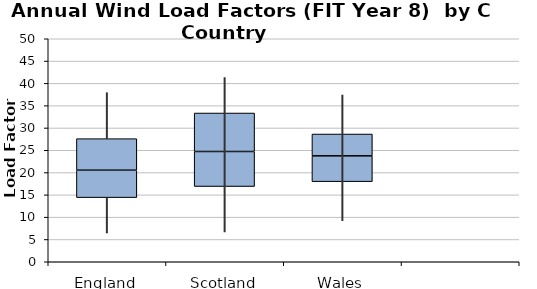
| Category | Series 0 | Series 1 | Series 2 |
|---|---|---|---|
| 0 | 14.38 | 6.15 | 7.07 |
| 1 | 16.87 | 7.85 | 8.63 |
| 2 | 17.96 | 5.79 | 4.89 |